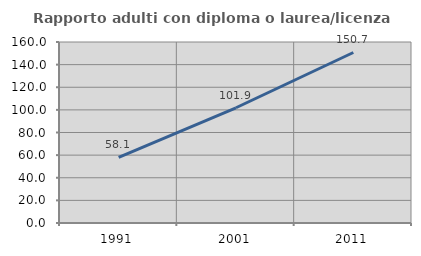
| Category | Rapporto adulti con diploma o laurea/licenza media  |
|---|---|
| 1991.0 | 58.065 |
| 2001.0 | 101.869 |
| 2011.0 | 150.722 |